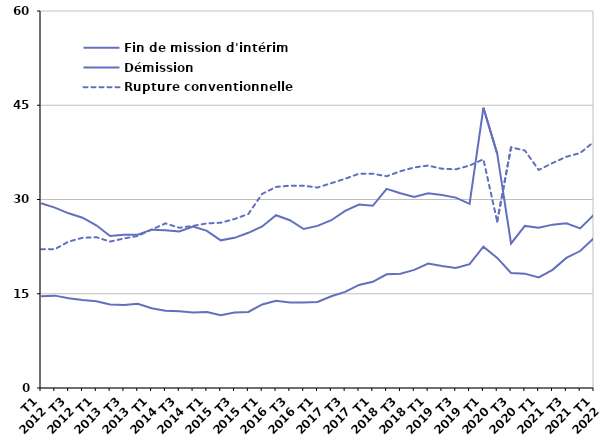
| Category | Fin de mission d'intérim | Démission | Rupture conventionnelle |
|---|---|---|---|
| T1
2012 | 29.4 | 14.6 | 22.1 |
| T2
2012 | 28.7 | 14.7 | 22.1 |
| T3
2012 | 27.8 | 14.3 | 23.3 |
| T4
2012 | 27.1 | 14 | 23.9 |
| T1
2013 | 25.9 | 13.8 | 24 |
| T2
2013 | 24.2 | 13.3 | 23.3 |
| T3
2013 | 24.4 | 13.2 | 23.8 |
| T4
2013 | 24.4 | 13.4 | 24.2 |
| T1
2014 | 25.2 | 12.7 | 25.2 |
| T2
2014 | 25.1 | 12.3 | 26.2 |
| T3
2014 | 24.9 | 12.2 | 25.5 |
| T4
2014 | 25.7 | 12 | 25.8 |
| T1
2015 | 25 | 12.1 | 26.2 |
| T2
2015 | 23.5 | 11.6 | 26.3 |
| T3
2015 | 23.9 | 12 | 26.9 |
| T4
2015 | 24.7 | 12.1 | 27.7 |
| T1
2016 | 25.7 | 13.3 | 30.9 |
| T2
2016 | 27.5 | 13.9 | 32 |
| T3
2016 | 26.7 | 13.6 | 32.2 |
| T4
2016 | 25.3 | 13.6 | 32.2 |
| T1
2017 | 25.8 | 13.7 | 31.9 |
| T2
2017 | 26.7 | 14.6 | 32.6 |
| T3
2017 | 28.2 | 15.3 | 33.3 |
| T4
2017 | 29.2 | 16.4 | 34.1 |
| T1
2018 | 29 | 16.9 | 34.1 |
| T2
2018 | 31.7 | 18.1 | 33.7 |
| T3
2018 | 31 | 18.2 | 34.5 |
| T4
2018 | 30.4 | 18.8 | 35.1 |
| T1
2019 | 31 | 19.8 | 35.4 |
| T2
2019 | 30.7 | 19.4 | 34.9 |
| T3
2019 | 30.3 | 19.1 | 34.8 |
| T4
2019 | 29.3 | 19.7 | 35.4 |
| T1
2020 | 44.6 | 22.5 | 36.4 |
| T2
2020 | 37.3 | 20.7 | 26.5 |
| T3
2020 | 23 | 18.3 | 38.3 |
| T4
2020 | 25.8 | 18.2 | 37.8 |
| T1
2021 | 25.5 | 17.6 | 34.7 |
| T2
2021 | 26 | 18.8 | 35.8 |
| T3
2021 | 26.2 | 20.7 | 36.8 |
| T4
2021 | 25.4 | 21.8 | 37.4 |
| T1
2022 | 27.6 | 23.9 | 39.2 |